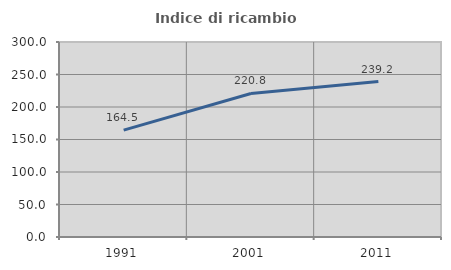
| Category | Indice di ricambio occupazionale  |
|---|---|
| 1991.0 | 164.452 |
| 2001.0 | 220.826 |
| 2011.0 | 239.204 |